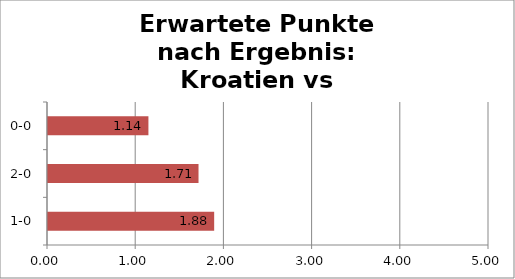
| Category | Series 0 |
|---|---|
| 1-0 | 1.884 |
| 2-0 | 1.707 |
| 0-0 | 1.139 |